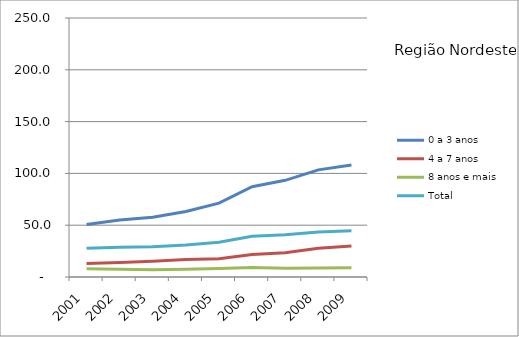
| Category | 0 a 3 anos | 4 a 7 anos | 8 anos e mais | Total |
|---|---|---|---|---|
| 2001.0 | 50.6 | 13.1 | 7.9 | 27.7 |
| 2002.0 | 55 | 13.9 | 7.4 | 28.7 |
| 2003.0 | 57.6 | 15.3 | 7.1 | 29.1 |
| 2004.0 | 63.2 | 17 | 7.4 | 30.9 |
| 2005.0 | 71.3 | 17.6 | 8.2 | 33.6 |
| 2006.0 | 87.2 | 21.8 | 9.2 | 39.4 |
| 2007.0 | 93.3 | 23.4 | 8.5 | 40.7 |
| 2008.0 | 103.4 | 27.7 | 8.6 | 43.4 |
| 2009.0 | 108.1 | 30 | 8.9 | 44.7 |